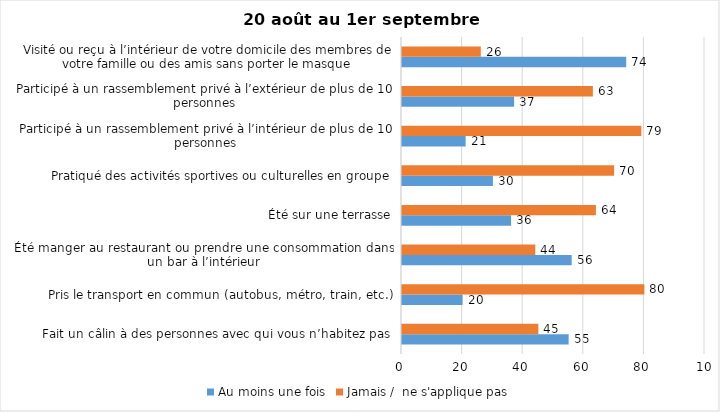
| Category | Au moins une fois | Jamais /  ne s'applique pas |
|---|---|---|
| Fait un câlin à des personnes avec qui vous n’habitez pas | 55 | 45 |
| Pris le transport en commun (autobus, métro, train, etc.) | 20 | 80 |
| Été manger au restaurant ou prendre une consommation dans un bar à l’intérieur | 56 | 44 |
| Été sur une terrasse | 36 | 64 |
| Pratiqué des activités sportives ou culturelles en groupe | 30 | 70 |
| Participé à un rassemblement privé à l’intérieur de plus de 10 personnes | 21 | 79 |
| Participé à un rassemblement privé à l’extérieur de plus de 10 personnes | 37 | 63 |
| Visité ou reçu à l’intérieur de votre domicile des membres de votre famille ou des amis sans porter le masque | 74 | 26 |